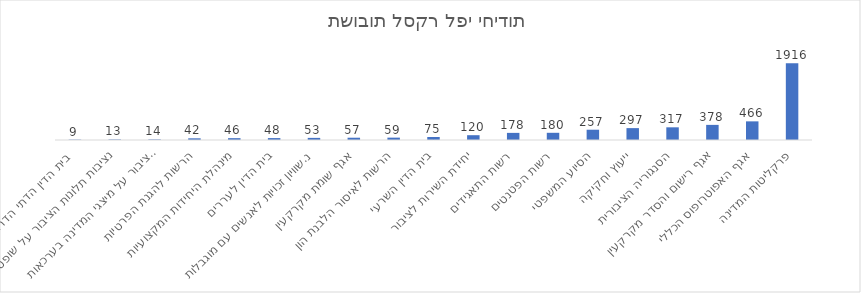
| Category | סה"כ |
|---|---|
| פרקליטות המדינה | 1916 |
| אגף האפוטרופוס הכללי | 466 |
| אגף רישום והסדר מקרקעין | 378 |
| הסנגוריה הציבורית | 317 |
| ייעוץ וחקיקה | 297 |
| הסיוע המשפטי | 257 |
| רשות הפטנטים | 180 |
| רשות התאגידים | 178 |
| יחידת השירות לציבור | 120 |
| בית הדין השרעי | 75 |
| הרשות לאיסור הלבנת הון | 59 |
| אגף שומת מקרקעין | 57 |
| נ.שוויון זכויות לאנשים עם מוגבלות | 53 |
| בית הדין לעררים | 48 |
| מינהלת היחידות המקצועיות | 46 |
| הרשות להגנת הפרטיות | 42 |
| נציבות ת. הציבור על מיצגי המדינה בערכאות | 14 |
| נציבות תלונות הציבור על שופטים | 13 |
| בית הדין הדתי הדרוזי  | 9 |